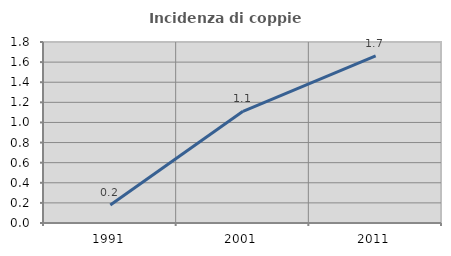
| Category | Incidenza di coppie miste |
|---|---|
| 1991.0 | 0.178 |
| 2001.0 | 1.11 |
| 2011.0 | 1.662 |